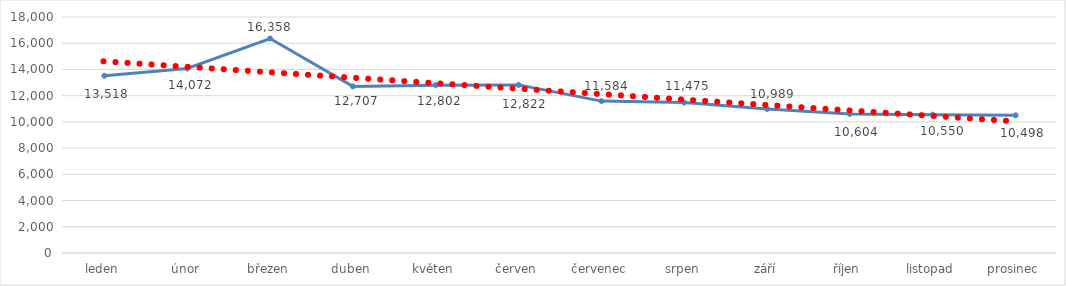
| Category | Series 0 |
|---|---|
| leden | 13518 |
| únor | 14072 |
| březen | 16358 |
| duben | 12707 |
| květen | 12802 |
| červen | 12822 |
| červenec | 11584 |
| srpen | 11475 |
| září | 10989 |
| říjen | 10604 |
| listopad | 10550 |
| prosinec | 10498 |